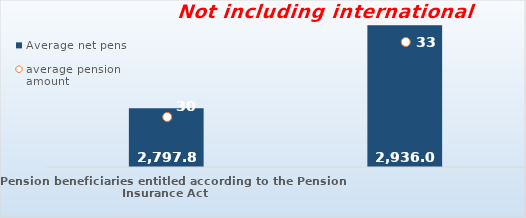
| Category | Average net pension  |
|---|---|
| Pension beneficiaries entitled according to the Pension Insurance Act   | 2797.89 |
| Pension beneficiaries entitled to pension FOR THE FIRST TIME in 2019 according to the Pension Insurance Act  - NEW BENEFICIARIES | 2936.053 |